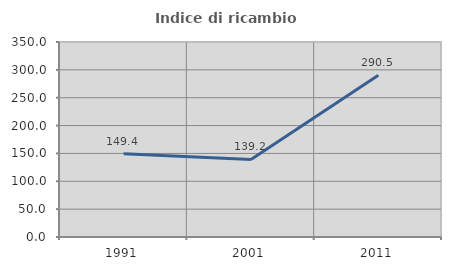
| Category | Indice di ricambio occupazionale  |
|---|---|
| 1991.0 | 149.405 |
| 2001.0 | 139.247 |
| 2011.0 | 290.476 |